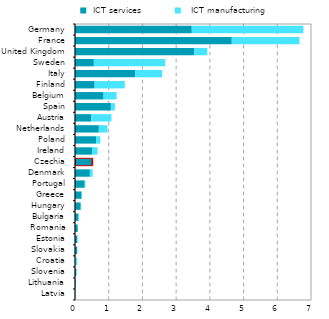
| Category |  ICT services  |   ICT manufacturing |
|---|---|---|
| Latvia | 0.005 | 0.002 |
| Lithuania | 0.025 | 0.004 |
| Slovenia | 0.039 | 0.014 |
| Croatia | 0.019 | 0.048 |
| Slovakia | 0.065 | 0.003 |
| Estonia | 0.066 | 0.016 |
| Romania | 0.082 | 0.001 |
| Bulgaria | 0.103 | 0.015 |
| Hungary | 0.17 | 0.011 |
| Greece | 0.195 | 0.013 |
| Portugal | 0.288 | 0.017 |
| Denmark | 0.441 | 0.084 |
| Czechia | 0.503 | 0.023 |
| Ireland | 0.504 | 0.162 |
| Poland | 0.627 | 0.123 |
| Netherlands | 0.707 | 0.257 |
| Austria | 0.485 | 0.596 |
| Spain | 1.064 | 0.12 |
| Belgium | 0.848 | 0.386 |
| Finland | 0.582 | 0.896 |
| Italy | 1.79 | 0.795 |
| Sweden | 0.56 | 2.118 |
| United Kingdom | 3.535 | 0.392 |
| France | 4.65 | 2.01 |
| Germany | 3.464 | 3.311 |